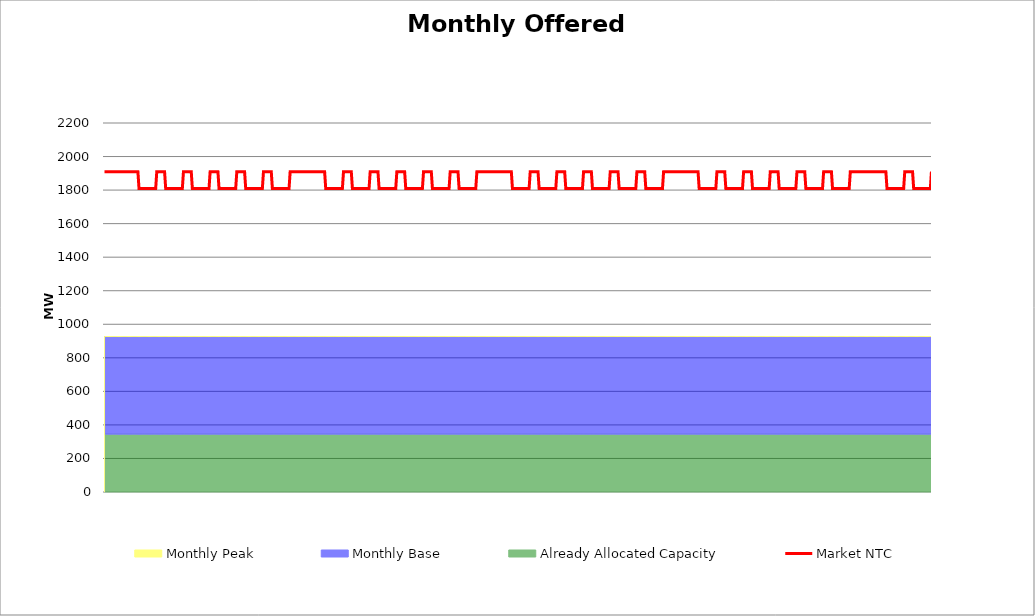
| Category | Market NTC |
|---|---|
| 0 | 1910 |
| 1 | 1910 |
| 2 | 1910 |
| 3 | 1910 |
| 4 | 1910 |
| 5 | 1910 |
| 6 | 1910 |
| 7 | 1910 |
| 8 | 1910 |
| 9 | 1910 |
| 10 | 1910 |
| 11 | 1910 |
| 12 | 1910 |
| 13 | 1910 |
| 14 | 1910 |
| 15 | 1910 |
| 16 | 1910 |
| 17 | 1910 |
| 18 | 1910 |
| 19 | 1910 |
| 20 | 1910 |
| 21 | 1910 |
| 22 | 1910 |
| 23 | 1910 |
| 24 | 1910 |
| 25 | 1910 |
| 26 | 1910 |
| 27 | 1910 |
| 28 | 1910 |
| 29 | 1910 |
| 30 | 1910 |
| 31 | 1810 |
| 32 | 1810 |
| 33 | 1810 |
| 34 | 1810 |
| 35 | 1810 |
| 36 | 1810 |
| 37 | 1810 |
| 38 | 1810 |
| 39 | 1810 |
| 40 | 1810 |
| 41 | 1810 |
| 42 | 1810 |
| 43 | 1810 |
| 44 | 1810 |
| 45 | 1810 |
| 46 | 1810 |
| 47 | 1910 |
| 48 | 1910 |
| 49 | 1910 |
| 50 | 1910 |
| 51 | 1910 |
| 52 | 1910 |
| 53 | 1910 |
| 54 | 1910 |
| 55 | 1810 |
| 56 | 1810 |
| 57 | 1810 |
| 58 | 1810 |
| 59 | 1810 |
| 60 | 1810 |
| 61 | 1810 |
| 62 | 1810 |
| 63 | 1810 |
| 64 | 1810 |
| 65 | 1810 |
| 66 | 1810 |
| 67 | 1810 |
| 68 | 1810 |
| 69 | 1810 |
| 70 | 1810 |
| 71 | 1910 |
| 72 | 1910 |
| 73 | 1910 |
| 74 | 1910 |
| 75 | 1910 |
| 76 | 1910 |
| 77 | 1910 |
| 78 | 1910 |
| 79 | 1810 |
| 80 | 1810 |
| 81 | 1810 |
| 82 | 1810 |
| 83 | 1810 |
| 84 | 1810 |
| 85 | 1810 |
| 86 | 1810 |
| 87 | 1810 |
| 88 | 1810 |
| 89 | 1810 |
| 90 | 1810 |
| 91 | 1810 |
| 92 | 1810 |
| 93 | 1810 |
| 94 | 1810 |
| 95 | 1910 |
| 96 | 1910 |
| 97 | 1910 |
| 98 | 1910 |
| 99 | 1910 |
| 100 | 1910 |
| 101 | 1910 |
| 102 | 1910 |
| 103 | 1810 |
| 104 | 1810 |
| 105 | 1810 |
| 106 | 1810 |
| 107 | 1810 |
| 108 | 1810 |
| 109 | 1810 |
| 110 | 1810 |
| 111 | 1810 |
| 112 | 1810 |
| 113 | 1810 |
| 114 | 1810 |
| 115 | 1810 |
| 116 | 1810 |
| 117 | 1810 |
| 118 | 1810 |
| 119 | 1910 |
| 120 | 1910 |
| 121 | 1910 |
| 122 | 1910 |
| 123 | 1910 |
| 124 | 1910 |
| 125 | 1910 |
| 126 | 1910 |
| 127 | 1810 |
| 128 | 1810 |
| 129 | 1810 |
| 130 | 1810 |
| 131 | 1810 |
| 132 | 1810 |
| 133 | 1810 |
| 134 | 1810 |
| 135 | 1810 |
| 136 | 1810 |
| 137 | 1810 |
| 138 | 1810 |
| 139 | 1810 |
| 140 | 1810 |
| 141 | 1810 |
| 142 | 1810 |
| 143 | 1910 |
| 144 | 1910 |
| 145 | 1910 |
| 146 | 1910 |
| 147 | 1910 |
| 148 | 1910 |
| 149 | 1910 |
| 150 | 1910 |
| 151 | 1810 |
| 152 | 1810 |
| 153 | 1810 |
| 154 | 1810 |
| 155 | 1810 |
| 156 | 1810 |
| 157 | 1810 |
| 158 | 1810 |
| 159 | 1810 |
| 160 | 1810 |
| 161 | 1810 |
| 162 | 1810 |
| 163 | 1810 |
| 164 | 1810 |
| 165 | 1810 |
| 166 | 1810 |
| 167 | 1910 |
| 168 | 1910 |
| 169 | 1910 |
| 170 | 1910 |
| 171 | 1910 |
| 172 | 1910 |
| 173 | 1910 |
| 174 | 1910 |
| 175 | 1910 |
| 176 | 1910 |
| 177 | 1910 |
| 178 | 1910 |
| 179 | 1910 |
| 180 | 1910 |
| 181 | 1910 |
| 182 | 1910 |
| 183 | 1910 |
| 184 | 1910 |
| 185 | 1910 |
| 186 | 1910 |
| 187 | 1910 |
| 188 | 1910 |
| 189 | 1910 |
| 190 | 1910 |
| 191 | 1910 |
| 192 | 1910 |
| 193 | 1910 |
| 194 | 1910 |
| 195 | 1910 |
| 196 | 1910 |
| 197 | 1910 |
| 198 | 1910 |
| 199 | 1810 |
| 200 | 1810 |
| 201 | 1810 |
| 202 | 1810 |
| 203 | 1810 |
| 204 | 1810 |
| 205 | 1810 |
| 206 | 1810 |
| 207 | 1810 |
| 208 | 1810 |
| 209 | 1810 |
| 210 | 1810 |
| 211 | 1810 |
| 212 | 1810 |
| 213 | 1810 |
| 214 | 1810 |
| 215 | 1910 |
| 216 | 1910 |
| 217 | 1910 |
| 218 | 1910 |
| 219 | 1910 |
| 220 | 1910 |
| 221 | 1910 |
| 222 | 1910 |
| 223 | 1810 |
| 224 | 1810 |
| 225 | 1810 |
| 226 | 1810 |
| 227 | 1810 |
| 228 | 1810 |
| 229 | 1810 |
| 230 | 1810 |
| 231 | 1810 |
| 232 | 1810 |
| 233 | 1810 |
| 234 | 1810 |
| 235 | 1810 |
| 236 | 1810 |
| 237 | 1810 |
| 238 | 1810 |
| 239 | 1910 |
| 240 | 1910 |
| 241 | 1910 |
| 242 | 1910 |
| 243 | 1910 |
| 244 | 1910 |
| 245 | 1910 |
| 246 | 1910 |
| 247 | 1810 |
| 248 | 1810 |
| 249 | 1810 |
| 250 | 1810 |
| 251 | 1810 |
| 252 | 1810 |
| 253 | 1810 |
| 254 | 1810 |
| 255 | 1810 |
| 256 | 1810 |
| 257 | 1810 |
| 258 | 1810 |
| 259 | 1810 |
| 260 | 1810 |
| 261 | 1810 |
| 262 | 1810 |
| 263 | 1910 |
| 264 | 1910 |
| 265 | 1910 |
| 266 | 1910 |
| 267 | 1910 |
| 268 | 1910 |
| 269 | 1910 |
| 270 | 1910 |
| 271 | 1810 |
| 272 | 1810 |
| 273 | 1810 |
| 274 | 1810 |
| 275 | 1810 |
| 276 | 1810 |
| 277 | 1810 |
| 278 | 1810 |
| 279 | 1810 |
| 280 | 1810 |
| 281 | 1810 |
| 282 | 1810 |
| 283 | 1810 |
| 284 | 1810 |
| 285 | 1810 |
| 286 | 1810 |
| 287 | 1910 |
| 288 | 1910 |
| 289 | 1910 |
| 290 | 1910 |
| 291 | 1910 |
| 292 | 1910 |
| 293 | 1910 |
| 294 | 1910 |
| 295 | 1810 |
| 296 | 1810 |
| 297 | 1810 |
| 298 | 1810 |
| 299 | 1810 |
| 300 | 1810 |
| 301 | 1810 |
| 302 | 1810 |
| 303 | 1810 |
| 304 | 1810 |
| 305 | 1810 |
| 306 | 1810 |
| 307 | 1810 |
| 308 | 1810 |
| 309 | 1810 |
| 310 | 1810 |
| 311 | 1910 |
| 312 | 1910 |
| 313 | 1910 |
| 314 | 1910 |
| 315 | 1910 |
| 316 | 1910 |
| 317 | 1910 |
| 318 | 1910 |
| 319 | 1810 |
| 320 | 1810 |
| 321 | 1810 |
| 322 | 1810 |
| 323 | 1810 |
| 324 | 1810 |
| 325 | 1810 |
| 326 | 1810 |
| 327 | 1810 |
| 328 | 1810 |
| 329 | 1810 |
| 330 | 1810 |
| 331 | 1810 |
| 332 | 1810 |
| 333 | 1810 |
| 334 | 1810 |
| 335 | 1910 |
| 336 | 1910 |
| 337 | 1910 |
| 338 | 1910 |
| 339 | 1910 |
| 340 | 1910 |
| 341 | 1910 |
| 342 | 1910 |
| 343 | 1910 |
| 344 | 1910 |
| 345 | 1910 |
| 346 | 1910 |
| 347 | 1910 |
| 348 | 1910 |
| 349 | 1910 |
| 350 | 1910 |
| 351 | 1910 |
| 352 | 1910 |
| 353 | 1910 |
| 354 | 1910 |
| 355 | 1910 |
| 356 | 1910 |
| 357 | 1910 |
| 358 | 1910 |
| 359 | 1910 |
| 360 | 1910 |
| 361 | 1910 |
| 362 | 1910 |
| 363 | 1910 |
| 364 | 1910 |
| 365 | 1910 |
| 366 | 1910 |
| 367 | 1810 |
| 368 | 1810 |
| 369 | 1810 |
| 370 | 1810 |
| 371 | 1810 |
| 372 | 1810 |
| 373 | 1810 |
| 374 | 1810 |
| 375 | 1810 |
| 376 | 1810 |
| 377 | 1810 |
| 378 | 1810 |
| 379 | 1810 |
| 380 | 1810 |
| 381 | 1810 |
| 382 | 1810 |
| 383 | 1910 |
| 384 | 1910 |
| 385 | 1910 |
| 386 | 1910 |
| 387 | 1910 |
| 388 | 1910 |
| 389 | 1910 |
| 390 | 1910 |
| 391 | 1810 |
| 392 | 1810 |
| 393 | 1810 |
| 394 | 1810 |
| 395 | 1810 |
| 396 | 1810 |
| 397 | 1810 |
| 398 | 1810 |
| 399 | 1810 |
| 400 | 1810 |
| 401 | 1810 |
| 402 | 1810 |
| 403 | 1810 |
| 404 | 1810 |
| 405 | 1810 |
| 406 | 1810 |
| 407 | 1910 |
| 408 | 1910 |
| 409 | 1910 |
| 410 | 1910 |
| 411 | 1910 |
| 412 | 1910 |
| 413 | 1910 |
| 414 | 1910 |
| 415 | 1810 |
| 416 | 1810 |
| 417 | 1810 |
| 418 | 1810 |
| 419 | 1810 |
| 420 | 1810 |
| 421 | 1810 |
| 422 | 1810 |
| 423 | 1810 |
| 424 | 1810 |
| 425 | 1810 |
| 426 | 1810 |
| 427 | 1810 |
| 428 | 1810 |
| 429 | 1810 |
| 430 | 1810 |
| 431 | 1910 |
| 432 | 1910 |
| 433 | 1910 |
| 434 | 1910 |
| 435 | 1910 |
| 436 | 1910 |
| 437 | 1910 |
| 438 | 1910 |
| 439 | 1810 |
| 440 | 1810 |
| 441 | 1810 |
| 442 | 1810 |
| 443 | 1810 |
| 444 | 1810 |
| 445 | 1810 |
| 446 | 1810 |
| 447 | 1810 |
| 448 | 1810 |
| 449 | 1810 |
| 450 | 1810 |
| 451 | 1810 |
| 452 | 1810 |
| 453 | 1810 |
| 454 | 1810 |
| 455 | 1910 |
| 456 | 1910 |
| 457 | 1910 |
| 458 | 1910 |
| 459 | 1910 |
| 460 | 1910 |
| 461 | 1910 |
| 462 | 1910 |
| 463 | 1810 |
| 464 | 1810 |
| 465 | 1810 |
| 466 | 1810 |
| 467 | 1810 |
| 468 | 1810 |
| 469 | 1810 |
| 470 | 1810 |
| 471 | 1810 |
| 472 | 1810 |
| 473 | 1810 |
| 474 | 1810 |
| 475 | 1810 |
| 476 | 1810 |
| 477 | 1810 |
| 478 | 1810 |
| 479 | 1910 |
| 480 | 1910 |
| 481 | 1910 |
| 482 | 1910 |
| 483 | 1910 |
| 484 | 1910 |
| 485 | 1910 |
| 486 | 1910 |
| 487 | 1810 |
| 488 | 1810 |
| 489 | 1810 |
| 490 | 1810 |
| 491 | 1810 |
| 492 | 1810 |
| 493 | 1810 |
| 494 | 1810 |
| 495 | 1810 |
| 496 | 1810 |
| 497 | 1810 |
| 498 | 1810 |
| 499 | 1810 |
| 500 | 1810 |
| 501 | 1810 |
| 502 | 1810 |
| 503 | 1910 |
| 504 | 1910 |
| 505 | 1910 |
| 506 | 1910 |
| 507 | 1910 |
| 508 | 1910 |
| 509 | 1910 |
| 510 | 1910 |
| 511 | 1910 |
| 512 | 1910 |
| 513 | 1910 |
| 514 | 1910 |
| 515 | 1910 |
| 516 | 1910 |
| 517 | 1910 |
| 518 | 1910 |
| 519 | 1910 |
| 520 | 1910 |
| 521 | 1910 |
| 522 | 1910 |
| 523 | 1910 |
| 524 | 1910 |
| 525 | 1910 |
| 526 | 1910 |
| 527 | 1910 |
| 528 | 1910 |
| 529 | 1910 |
| 530 | 1910 |
| 531 | 1910 |
| 532 | 1910 |
| 533 | 1910 |
| 534 | 1910 |
| 535 | 1810 |
| 536 | 1810 |
| 537 | 1810 |
| 538 | 1810 |
| 539 | 1810 |
| 540 | 1810 |
| 541 | 1810 |
| 542 | 1810 |
| 543 | 1810 |
| 544 | 1810 |
| 545 | 1810 |
| 546 | 1810 |
| 547 | 1810 |
| 548 | 1810 |
| 549 | 1810 |
| 550 | 1810 |
| 551 | 1910 |
| 552 | 1910 |
| 553 | 1910 |
| 554 | 1910 |
| 555 | 1910 |
| 556 | 1910 |
| 557 | 1910 |
| 558 | 1910 |
| 559 | 1810 |
| 560 | 1810 |
| 561 | 1810 |
| 562 | 1810 |
| 563 | 1810 |
| 564 | 1810 |
| 565 | 1810 |
| 566 | 1810 |
| 567 | 1810 |
| 568 | 1810 |
| 569 | 1810 |
| 570 | 1810 |
| 571 | 1810 |
| 572 | 1810 |
| 573 | 1810 |
| 574 | 1810 |
| 575 | 1910 |
| 576 | 1910 |
| 577 | 1910 |
| 578 | 1910 |
| 579 | 1910 |
| 580 | 1910 |
| 581 | 1910 |
| 582 | 1910 |
| 583 | 1810 |
| 584 | 1810 |
| 585 | 1810 |
| 586 | 1810 |
| 587 | 1810 |
| 588 | 1810 |
| 589 | 1810 |
| 590 | 1810 |
| 591 | 1810 |
| 592 | 1810 |
| 593 | 1810 |
| 594 | 1810 |
| 595 | 1810 |
| 596 | 1810 |
| 597 | 1810 |
| 598 | 1810 |
| 599 | 1910 |
| 600 | 1910 |
| 601 | 1910 |
| 602 | 1910 |
| 603 | 1910 |
| 604 | 1910 |
| 605 | 1910 |
| 606 | 1910 |
| 607 | 1810 |
| 608 | 1810 |
| 609 | 1810 |
| 610 | 1810 |
| 611 | 1810 |
| 612 | 1810 |
| 613 | 1810 |
| 614 | 1810 |
| 615 | 1810 |
| 616 | 1810 |
| 617 | 1810 |
| 618 | 1810 |
| 619 | 1810 |
| 620 | 1810 |
| 621 | 1810 |
| 622 | 1810 |
| 623 | 1910 |
| 624 | 1910 |
| 625 | 1910 |
| 626 | 1910 |
| 627 | 1910 |
| 628 | 1910 |
| 629 | 1910 |
| 630 | 1910 |
| 631 | 1810 |
| 632 | 1810 |
| 633 | 1810 |
| 634 | 1810 |
| 635 | 1810 |
| 636 | 1810 |
| 637 | 1810 |
| 638 | 1810 |
| 639 | 1810 |
| 640 | 1810 |
| 641 | 1810 |
| 642 | 1810 |
| 643 | 1810 |
| 644 | 1810 |
| 645 | 1810 |
| 646 | 1810 |
| 647 | 1910 |
| 648 | 1910 |
| 649 | 1910 |
| 650 | 1910 |
| 651 | 1910 |
| 652 | 1910 |
| 653 | 1910 |
| 654 | 1910 |
| 655 | 1810 |
| 656 | 1810 |
| 657 | 1810 |
| 658 | 1810 |
| 659 | 1810 |
| 660 | 1810 |
| 661 | 1810 |
| 662 | 1810 |
| 663 | 1810 |
| 664 | 1810 |
| 665 | 1810 |
| 666 | 1810 |
| 667 | 1810 |
| 668 | 1810 |
| 669 | 1810 |
| 670 | 1810 |
| 671 | 1910 |
| 672 | 1910 |
| 673 | 1910 |
| 674 | 1910 |
| 675 | 1910 |
| 676 | 1910 |
| 677 | 1910 |
| 678 | 1910 |
| 679 | 1910 |
| 680 | 1910 |
| 681 | 1910 |
| 682 | 1910 |
| 683 | 1910 |
| 684 | 1910 |
| 685 | 1910 |
| 686 | 1910 |
| 687 | 1910 |
| 688 | 1910 |
| 689 | 1910 |
| 690 | 1910 |
| 691 | 1910 |
| 692 | 1910 |
| 693 | 1910 |
| 694 | 1910 |
| 695 | 1910 |
| 696 | 1910 |
| 697 | 1910 |
| 698 | 1910 |
| 699 | 1910 |
| 700 | 1910 |
| 701 | 1910 |
| 702 | 1910 |
| 703 | 1910 |
| 704 | 1810 |
| 705 | 1810 |
| 706 | 1810 |
| 707 | 1810 |
| 708 | 1810 |
| 709 | 1810 |
| 710 | 1810 |
| 711 | 1810 |
| 712 | 1810 |
| 713 | 1810 |
| 714 | 1810 |
| 715 | 1810 |
| 716 | 1810 |
| 717 | 1810 |
| 718 | 1810 |
| 719 | 1810 |
| 720 | 1910 |
| 721 | 1910 |
| 722 | 1910 |
| 723 | 1910 |
| 724 | 1910 |
| 725 | 1910 |
| 726 | 1910 |
| 727 | 1910 |
| 728 | 1810 |
| 729 | 1810 |
| 730 | 1810 |
| 731 | 1810 |
| 732 | 1810 |
| 733 | 1810 |
| 734 | 1810 |
| 735 | 1810 |
| 736 | 1810 |
| 737 | 1810 |
| 738 | 1810 |
| 739 | 1810 |
| 740 | 1810 |
| 741 | 1810 |
| 742 | 1810 |
| 743 | 1810 |
| 744 | 1910 |